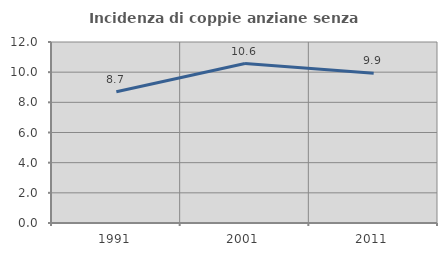
| Category | Incidenza di coppie anziane senza figli  |
|---|---|
| 1991.0 | 8.704 |
| 2001.0 | 10.572 |
| 2011.0 | 9.925 |